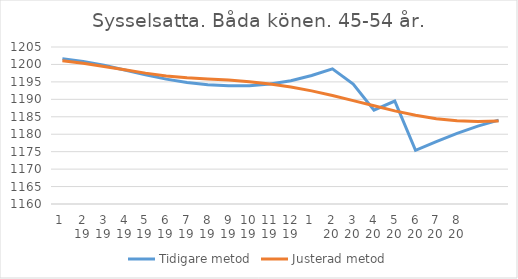
| Category | Tidigare metod | Justerad metod |
|---|---|---|
| 0 | 1201.66 | 1201.05 |
| 1 | 1200.88 | 1200.34 |
| 2 | 1199.76 | 1199.44 |
| 3 | 1198.43 | 1198.46 |
| 4 | 1197.05 | 1197.51 |
| 5 | 1195.79 | 1196.72 |
| 6 | 1194.83 | 1196.19 |
| 7 | 1194.18 | 1195.84 |
| 8 | 1193.86 | 1195.51 |
| 9 | 1193.91 | 1195.06 |
| 10 | 1194.38 | 1194.42 |
| 11 | 1195.35 | 1193.55 |
| 12 | 1196.82 | 1192.43 |
| 13 | 1198.72 | 1191.11 |
| 14 | 1194.39 | 1189.64 |
| 15 | 1186.88 | 1188.14 |
| 16 | 1189.52 | 1186.7 |
| 17 | 1175.37 | 1185.44 |
| 18 | 1177.87 | 1184.45 |
| 19 | 1180.23 | 1183.87 |
| 20 | 1182.31 | 1183.68 |
| 21 | 1184.04 | 1183.81 |